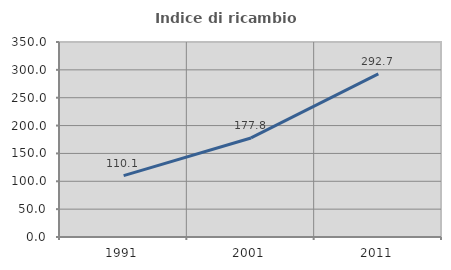
| Category | Indice di ricambio occupazionale  |
|---|---|
| 1991.0 | 110.053 |
| 2001.0 | 177.778 |
| 2011.0 | 292.708 |